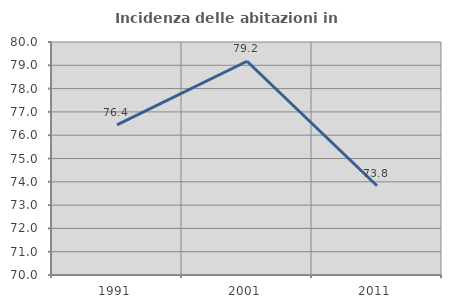
| Category | Incidenza delle abitazioni in proprietà  |
|---|---|
| 1991.0 | 76.443 |
| 2001.0 | 79.173 |
| 2011.0 | 73.83 |